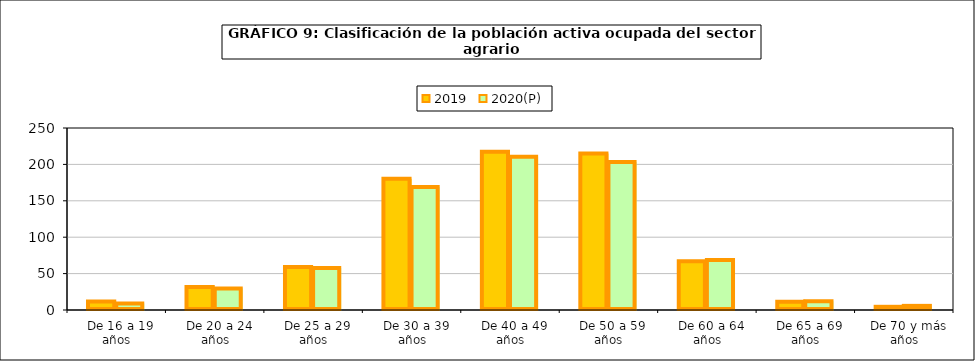
| Category | 2019 | 2020(P) |
|---|---|---|
|   De 16 a 19 años | 11.525 | 8.95 |
|   De 20 a 24 años | 31.6 | 29.7 |
|   De 25 a 29 años | 58.975 | 57.675 |
|   De 30 a 39 años | 180.2 | 169.1 |
|   De 40 a 49 años | 217.275 | 210.575 |
|   De 50 a 59 años | 214.925 | 203.15 |
|   De 60 a 64 años | 67.1 | 68.55 |
|   De 65 a 69 años | 11.25 | 11.925 |
|   De 70 y más años | 4.4 | 5.675 |